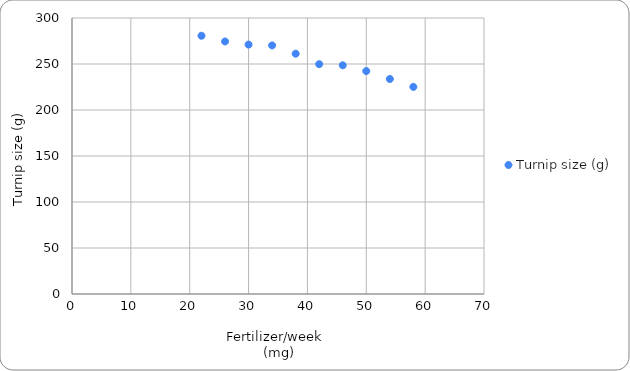
| Category | Turnip size (g) |
|---|---|
| 22.0 | 280.7 |
| 26.0 | 274.5 |
| 30.0 | 271.1 |
| 34.0 | 270.2 |
| 38.0 | 261.2 |
| 42.0 | 249.8 |
| 46.0 | 248.6 |
| 50.0 | 242.3 |
| 54.0 | 233.7 |
| 58.0 | 225.1 |